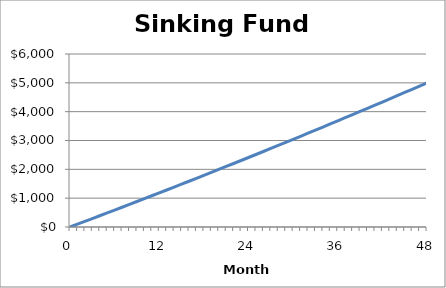
| Category | Series 0 |
|---|---|
| 0.0 | 0 |
| 1.0 | 97 |
| 2.0 | 194.29 |
| 3.0 | 291.87 |
| 4.0 | 389.75 |
| 5.0 | 487.92 |
| 6.0 | 586.38 |
| 7.0 | 685.14 |
| 8.0 | 784.2 |
| 9.0 | 883.55 |
| 10.0 | 983.2 |
| 11.0 | 1083.15 |
| 12.0 | 1183.4 |
| 13.0 | 1283.95 |
| 14.0 | 1384.8 |
| 15.0 | 1485.95 |
| 16.0 | 1587.41 |
| 17.0 | 1689.17 |
| 18.0 | 1791.24 |
| 19.0 | 1893.61 |
| 20.0 | 1996.29 |
| 21.0 | 2099.28 |
| 22.0 | 2202.58 |
| 23.0 | 2306.19 |
| 24.0 | 2410.11 |
| 25.0 | 2514.34 |
| 26.0 | 2618.88 |
| 27.0 | 2723.74 |
| 28.0 | 2828.91 |
| 29.0 | 2934.4 |
| 30.0 | 3040.2 |
| 31.0 | 3146.32 |
| 32.0 | 3252.76 |
| 33.0 | 3359.52 |
| 34.0 | 3466.6 |
| 35.0 | 3574 |
| 36.0 | 3681.72 |
| 37.0 | 3789.77 |
| 38.0 | 3898.14 |
| 39.0 | 4006.83 |
| 40.0 | 4115.85 |
| 41.0 | 4225.2 |
| 42.0 | 4334.88 |
| 43.0 | 4444.88 |
| 44.0 | 4555.21 |
| 45.0 | 4665.88 |
| 46.0 | 4776.88 |
| 47.0 | 4888.21 |
| 48.0 | 4999.87 |